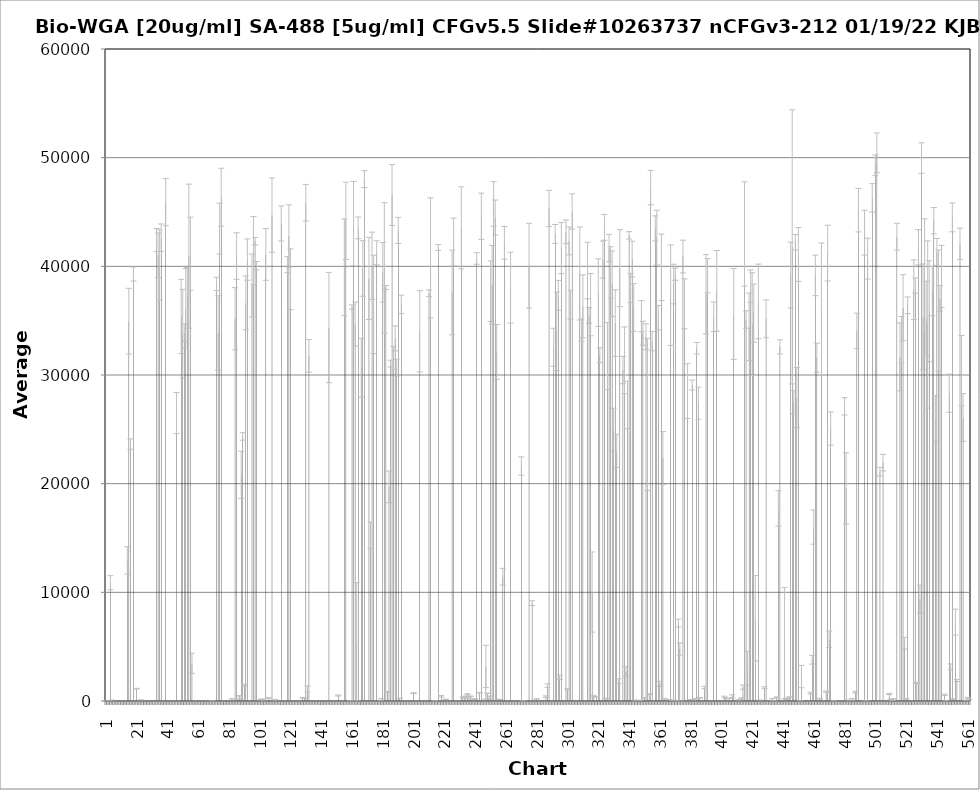
| Category | Average RFU |
|---|---|
| 1.0 | 6.5 |
| 2.0 | -50 |
| 3.0 | -6 |
| 4.0 | 10887.25 |
| 5.0 | 27.75 |
| 6.0 | -101.75 |
| 7.0 | -55.25 |
| 8.0 | -62.5 |
| 9.0 | -59.5 |
| 10.0 | -113 |
| 11.0 | -28 |
| 12.0 | -39.75 |
| 13.0 | -26.25 |
| 14.0 | -41.75 |
| 15.0 | 12937.75 |
| 16.0 | 34955 |
| 17.0 | 23641.5 |
| 18.0 | -74.75 |
| 19.0 | 39290.75 |
| 20.0 | -40.5 |
| 21.0 | 1135.5 |
| 22.0 | -120.5 |
| 23.0 | -78 |
| 24.0 | 22.25 |
| 25.0 | -43 |
| 26.0 | -100 |
| 27.0 | -34.75 |
| 28.0 | -93.75 |
| 29.0 | -87.5 |
| 30.0 | -123 |
| 31.0 | -75.5 |
| 32.0 | -18 |
| 33.0 | -82.25 |
| 34.0 | 42429.5 |
| 35.0 | 41009 |
| 36.0 | 40126.5 |
| 37.0 | 42639.5 |
| 38.0 | -98 |
| 39.0 | -103.75 |
| 40.0 | 45900.5 |
| 41.0 | -25 |
| 42.0 | -104.25 |
| 43.0 | -42 |
| 44.0 | -67.75 |
| 45.0 | -55 |
| 46.0 | -50.75 |
| 47.0 | 26495.75 |
| 48.0 | -132.25 |
| 49.0 | -72 |
| 50.0 | 35383.75 |
| 51.0 | 33797.75 |
| 52.0 | 33888.5 |
| 53.0 | 36144.25 |
| 54.0 | 37287 |
| 55.0 | 40930.75 |
| 56.0 | 41161.25 |
| 57.0 | 3473.5 |
| 58.0 | -24.75 |
| 59.0 | -68.5 |
| 60.0 | -110 |
| 61.0 | -104.5 |
| 62.0 | -87 |
| 63.0 | -63.5 |
| 64.0 | -91.75 |
| 65.0 | -89.5 |
| 66.0 | -74.25 |
| 67.0 | -98 |
| 68.0 | -78.25 |
| 69.0 | -73.5 |
| 70.0 | 15.75 |
| 71.0 | -78.25 |
| 72.0 | -19.25 |
| 73.0 | 38388.75 |
| 74.0 | 33869.5 |
| 75.0 | 43478.5 |
| 76.0 | 46360.25 |
| 77.0 | -56.25 |
| 78.0 | -39.5 |
| 79.0 | -79 |
| 80.0 | -129.5 |
| 81.0 | -65.25 |
| 82.0 | -18.75 |
| 83.0 | 209.5 |
| 84.0 | -109.25 |
| 85.0 | 35174.25 |
| 86.0 | 40945.5 |
| 87.0 | 157 |
| 88.0 | 442.5 |
| 89.0 | 20810.75 |
| 90.0 | 24345.5 |
| 91.0 | 1461.5 |
| 92.0 | 36647.5 |
| 93.0 | 40620 |
| 94.0 | -57.5 |
| 95.0 | -82.5 |
| 96.0 | 38236 |
| 97.0 | 41454.5 |
| 98.0 | 42314.75 |
| 99.0 | 40058 |
| 100.0 | -36 |
| 101.0 | -51.75 |
| 102.0 | 161.25 |
| 103.0 | 108.5 |
| 104.0 | -66.75 |
| 105.0 | 41098.5 |
| 106.0 | -48 |
| 107.0 | 265 |
| 108.0 | -60.25 |
| 109.0 | 44715.75 |
| 110.0 | -38.25 |
| 111.0 | -114.75 |
| 112.0 | -80 |
| 113.0 | -57.25 |
| 114.0 | -53.75 |
| 115.0 | 43941.5 |
| 116.0 | -87.75 |
| 117.0 | -66.25 |
| 118.0 | -72 |
| 119.0 | 40157.25 |
| 120.0 | 42785 |
| 121.0 | 38812 |
| 122.0 | -48.25 |
| 123.0 | -41.5 |
| 124.0 | -50.75 |
| 125.0 | -41.25 |
| 126.0 | -82 |
| 127.0 | -81.25 |
| 128.0 | -48 |
| 129.0 | 296.25 |
| 130.0 | 292 |
| 131.0 | 45855.75 |
| 132.0 | 1098 |
| 133.0 | 31760.75 |
| 134.0 | -146.5 |
| 135.0 | -51 |
| 136.0 | -86.75 |
| 137.0 | -161.25 |
| 138.0 | -119.25 |
| 139.0 | -81.75 |
| 140.0 | -68.25 |
| 141.0 | -145.25 |
| 142.0 | -54 |
| 143.0 | -79.5 |
| 144.0 | -73 |
| 145.0 | -29.25 |
| 146.0 | 34366.5 |
| 147.0 | -65.25 |
| 148.0 | -104.5 |
| 149.0 | -37.5 |
| 150.0 | -53.75 |
| 151.0 | -57.5 |
| 152.0 | 504.5 |
| 153.0 | -67.25 |
| 154.0 | -80 |
| 155.0 | -45.5 |
| 156.0 | 39914 |
| 157.0 | 44183.5 |
| 158.0 | -77.25 |
| 159.0 | -32 |
| 160.0 | -21.25 |
| 161.0 | 36249.5 |
| 162.0 | 43937.5 |
| 163.0 | 34688 |
| 164.0 | 5460.75 |
| 165.0 | 43537.5 |
| 166.0 | -64.5 |
| 167.0 | 30659.5 |
| 168.0 | 39805.25 |
| 169.0 | 48030.75 |
| 170.0 | -43.75 |
| 171.0 | -49.25 |
| 172.0 | 38891 |
| 173.0 | 15262.75 |
| 174.0 | 40047.25 |
| 175.0 | 36495.25 |
| 176.0 | -77.5 |
| 177.0 | 41254 |
| 178.0 | -48.5 |
| 179.0 | -63.75 |
| 180.0 | 118 |
| 181.0 | 39449.75 |
| 182.0 | 39848 |
| 183.0 | 38050 |
| 184.0 | 826 |
| 185.0 | 19709.5 |
| 186.0 | 31049.75 |
| 187.0 | 46565 |
| 188.0 | 31542.25 |
| 189.0 | 33368.75 |
| 190.0 | 30678.75 |
| 191.0 | 43309.5 |
| 192.0 | 251.5 |
| 193.0 | 36497.25 |
| 194.0 | -65.75 |
| 195.0 | -41.25 |
| 196.0 | -44.75 |
| 197.0 | -45.25 |
| 198.0 | -44 |
| 199.0 | -66.75 |
| 200.0 | -310.25 |
| 201.0 | 721 |
| 202.0 | -57.25 |
| 203.0 | -59 |
| 204.0 | -68.75 |
| 205.0 | 34021.5 |
| 206.0 | -88.75 |
| 207.0 | -121.25 |
| 208.0 | -106.75 |
| 209.0 | -65.25 |
| 210.0 | -35.25 |
| 211.0 | 37521 |
| 212.0 | 40775.75 |
| 213.0 | -102 |
| 214.0 | -115 |
| 215.0 | -5 |
| 216.0 | -93.5 |
| 217.0 | 41736 |
| 218.0 | -75 |
| 219.0 | 434.75 |
| 220.0 | -386.75 |
| 221.0 | -55 |
| 222.0 | 154.5 |
| 223.0 | -88.25 |
| 224.0 | -92.25 |
| 225.0 | -140.75 |
| 226.0 | 37592 |
| 227.0 | 42238.75 |
| 228.0 | -43.25 |
| 229.0 | -38 |
| 230.0 | -90.5 |
| 231.0 | -91 |
| 232.0 | 43540.25 |
| 233.0 | 335.5 |
| 234.0 | 331 |
| 235.0 | 434.75 |
| 236.0 | 624.25 |
| 237.0 | 390.75 |
| 238.0 | 433.25 |
| 239.0 | 154.25 |
| 240.0 | -101.5 |
| 241.0 | 187.75 |
| 242.0 | 40725.25 |
| 243.0 | -38.25 |
| 244.0 | 764.25 |
| 245.0 | 44608.5 |
| 246.0 | -60.5 |
| 247.0 | 29.5 |
| 248.0 | 3180.75 |
| 249.0 | 701.75 |
| 250.0 | 293 |
| 251.0 | 37708.25 |
| 252.0 | 38296.5 |
| 253.0 | 45740.75 |
| 254.0 | 44486.5 |
| 255.0 | 32124.75 |
| 256.0 | -58.5 |
| 257.0 | 150.25 |
| 258.0 | -60 |
| 259.0 | 11436 |
| 260.0 | 42162.5 |
| 261.0 | -73 |
| 262.0 | -90.5 |
| 263.0 | -74.5 |
| 264.0 | 38037.5 |
| 265.0 | -85 |
| 266.0 | -57 |
| 267.0 | -83 |
| 268.0 | -85.25 |
| 269.0 | -381.5 |
| 270.0 | -52.5 |
| 271.0 | 21621.75 |
| 272.0 | -16.5 |
| 273.0 | -72 |
| 274.0 | -101.75 |
| 275.0 | -36 |
| 276.0 | 40061.25 |
| 277.0 | -37.25 |
| 278.0 | 9006.75 |
| 279.0 | -57.75 |
| 280.0 | -43 |
| 281.0 | 194.5 |
| 282.0 | -79.75 |
| 283.0 | -49.25 |
| 284.0 | -32.25 |
| 285.0 | -61 |
| 286.0 | -24.25 |
| 287.0 | 402.75 |
| 288.0 | 1420 |
| 289.0 | 45326 |
| 290.0 | -118 |
| 291.0 | -34 |
| 292.0 | 32552.5 |
| 293.0 | 42976.75 |
| 294.0 | 34025.75 |
| 295.0 | 37332.75 |
| 296.0 | 2189.25 |
| 297.0 | 41679.25 |
| 298.0 | -46.25 |
| 299.0 | -126.75 |
| 300.0 | 43174.75 |
| 301.0 | 1091.5 |
| 302.0 | 42343.75 |
| 303.0 | 36464.75 |
| 304.0 | 45048 |
| 305.0 | -46.5 |
| 306.0 | -36 |
| 307.0 | -86 |
| 308.0 | -107.75 |
| 309.0 | 39337.5 |
| 310.0 | 34134.25 |
| 311.0 | 36318.5 |
| 312.0 | -89.5 |
| 313.0 | -59.75 |
| 314.0 | 39614.5 |
| 315.0 | 35479.25 |
| 316.0 | 36471 |
| 317.0 | 10025.25 |
| 318.0 | 448.25 |
| 319.0 | -274.75 |
| 320.0 | 395.5 |
| 321.0 | 37583.5 |
| 322.0 | 31822.5 |
| 323.0 | -58.75 |
| 324.0 | 40624 |
| 325.0 | 43584.75 |
| 326.0 | 241.25 |
| 327.0 | 31738.75 |
| 328.0 | 41678.75 |
| 329.0 | 39450.5 |
| 330.0 | 38409.25 |
| 331.0 | 24978.25 |
| 332.0 | 34776.5 |
| 333.0 | 23016.75 |
| 334.0 | 1834.75 |
| 335.0 | 39830.5 |
| 336.0 | -90 |
| 337.0 | 30451 |
| 338.0 | 31356.75 |
| 339.0 | 2724 |
| 340.0 | 27240.5 |
| 341.0 | 42850.75 |
| 342.0 | 38011.75 |
| 343.0 | 40666.75 |
| 344.0 | 36205.75 |
| 345.0 | 42.75 |
| 346.0 | -76 |
| 347.0 | -57.25 |
| 348.0 | -26 |
| 349.0 | 35412.75 |
| 350.0 | 33844.25 |
| 351.0 | 297.25 |
| 352.0 | 33527.25 |
| 353.0 | 26360.5 |
| 354.0 | 632.25 |
| 355.0 | 47248.5 |
| 356.0 | 33118.25 |
| 357.0 | -36.75 |
| 358.0 | 43490 |
| 359.0 | 42648 |
| 360.0 | 35278.75 |
| 361.0 | 1583.5 |
| 362.0 | 39909.75 |
| 363.0 | 22351.25 |
| 364.0 | 214.25 |
| 365.0 | -72.5 |
| 366.0 | -74.25 |
| 367.0 | 136.5 |
| 368.0 | 37346.25 |
| 369.0 | -7.25 |
| 370.0 | 38370.5 |
| 371.0 | 39274.5 |
| 372.0 | -4.25 |
| 373.0 | 7176 |
| 374.0 | 4777.25 |
| 375.0 | 2.75 |
| 376.0 | 40898.25 |
| 377.0 | 36550 |
| 378.0 | -67.25 |
| 379.0 | 28519.75 |
| 380.0 | -91.75 |
| 381.0 | 134 |
| 382.0 | 29077.5 |
| 383.0 | 148.25 |
| 384.0 | 58.5 |
| 385.0 | 32463.75 |
| 386.0 | 27401.5 |
| 387.0 | 290.5 |
| 388.0 | -21.25 |
| 389.0 | -23.5 |
| 390.0 | 1239.5 |
| 391.0 | 37427 |
| 392.0 | 39137.25 |
| 393.0 | -88.25 |
| 394.0 | -69.5 |
| 395.0 | -105 |
| 396.0 | 35359.25 |
| 397.0 | -32 |
| 398.0 | 37744.75 |
| 399.0 | -68.75 |
| 400.0 | -54 |
| 401.0 | -74.75 |
| 402.0 | -27.25 |
| 403.0 | 371.75 |
| 404.0 | 239.25 |
| 405.0 | -33.75 |
| 406.0 | 230.75 |
| 407.0 | -126 |
| 408.0 | 441 |
| 409.0 | 35622.5 |
| 410.0 | -61 |
| 411.0 | -99.75 |
| 412.0 | 104.75 |
| 413.0 | -77.25 |
| 414.0 | 240.25 |
| 415.0 | 1271 |
| 416.0 | 42977.75 |
| 417.0 | 35106 |
| 418.0 | 3015.75 |
| 419.0 | 34429 |
| 420.0 | 38175.5 |
| 421.0 | 34679.25 |
| 422.0 | 35694.75 |
| 423.0 | 7621.75 |
| 424.0 | -60.25 |
| 425.0 | 36774.25 |
| 426.0 | 11.5 |
| 427.0 | -71.5 |
| 428.0 | -31.75 |
| 429.0 | 1220 |
| 430.0 | 35168 |
| 431.0 | -163.25 |
| 432.0 | -237.75 |
| 433.0 | -166 |
| 434.0 | 223.5 |
| 435.0 | -4 |
| 436.0 | -40.75 |
| 437.0 | 345.75 |
| 438.0 | 17723.75 |
| 439.0 | 32588.25 |
| 440.0 | -136.25 |
| 441.0 | -42.5 |
| 442.0 | 5334.25 |
| 443.0 | 131.75 |
| 444.0 | 191 |
| 445.0 | 353.5 |
| 446.0 | 39203.5 |
| 447.0 | 41789.5 |
| 448.0 | 27502 |
| 449.0 | 42214.25 |
| 450.0 | 27929.75 |
| 451.0 | 41092.5 |
| 452.0 | -8.25 |
| 453.0 | 2243.75 |
| 454.0 | -86.75 |
| 455.0 | -124.25 |
| 456.0 | -49.25 |
| 457.0 | -40.5 |
| 458.0 | -15.25 |
| 459.0 | 722.75 |
| 460.0 | 3793.5 |
| 461.0 | 16003 |
| 462.0 | 39164.25 |
| 463.0 | 31588 |
| 464.0 | -27.5 |
| 465.0 | 223.25 |
| 466.0 | 36050.75 |
| 467.0 | -18.75 |
| 468.0 | -86 |
| 469.0 | 866.5 |
| 470.0 | 41219.25 |
| 471.0 | 5676.5 |
| 472.0 | 25071.5 |
| 473.0 | -16 |
| 474.0 | -4 |
| 475.0 | -119.5 |
| 476.0 | -131 |
| 477.0 | -14.5 |
| 478.0 | -56 |
| 479.0 | -69.75 |
| 480.0 | -9.5 |
| 481.0 | 27114.5 |
| 482.0 | 19561.75 |
| 483.0 | 0 |
| 484.0 | -76 |
| 485.0 | -57.75 |
| 486.0 | 166 |
| 487.0 | -41.75 |
| 488.0 | 812.75 |
| 489.0 | 34057.5 |
| 490.0 | 45171.25 |
| 491.0 | -61.25 |
| 492.0 | -34.25 |
| 493.0 | -101.25 |
| 494.0 | 43099.75 |
| 495.0 | -13 |
| 496.0 | 40710 |
| 497.0 | -106.75 |
| 498.0 | -152 |
| 499.0 | 46308 |
| 500.0 | -115.75 |
| 501.0 | 49293.25 |
| 502.0 | 50447 |
| 503.0 | -76.75 |
| 504.0 | 21106.5 |
| 505.0 | -71.5 |
| 506.0 | 21931.5 |
| 507.0 | -24.25 |
| 508.0 | -132.5 |
| 509.0 | -44.25 |
| 510.0 | 649 |
| 511.0 | 150 |
| 512.0 | -2.25 |
| 513.0 | 205.25 |
| 514.0 | -60 |
| 515.0 | 42729.75 |
| 516.0 | -35.75 |
| 517.0 | 31663.75 |
| 518.0 | 33261.75 |
| 519.0 | 36197.25 |
| 520.0 | 5310.5 |
| 521.0 | 210 |
| 522.0 | 36415.75 |
| 523.0 | -84.25 |
| 524.0 | -83.75 |
| 525.0 | -60.75 |
| 526.0 | 37849.25 |
| 527.0 | 38231 |
| 528.0 | 1655.75 |
| 529.0 | 41758.75 |
| 530.0 | 9360.5 |
| 531.0 | 49963.5 |
| 532.0 | 35350.75 |
| 533.0 | 39130.75 |
| 534.0 | 35197.25 |
| 535.0 | 34647.5 |
| 536.0 | 35865.75 |
| 537.0 | -83.5 |
| 538.0 | 37726 |
| 539.0 | 44196.5 |
| 540.0 | 26006.25 |
| 541.0 | 41323.5 |
| 542.0 | 35933 |
| 543.0 | 37047.75 |
| 544.0 | 39073.25 |
| 545.0 | -108.5 |
| 546.0 | 575.5 |
| 547.0 | -28.75 |
| 548.0 | -78.75 |
| 549.0 | 28327.75 |
| 550.0 | 3140 |
| 551.0 | 44509.75 |
| 552.0 | 177.75 |
| 553.0 | 7260.75 |
| 554.0 | 1894.75 |
| 555.0 | -22.75 |
| 556.0 | 42066 |
| 557.0 | 30396.25 |
| 558.0 | 26092.25 |
| 559.0 | -69.5 |
| 560.0 | 13 |
| 561.0 | 262.5 |
| 562.0 | 127.5 |